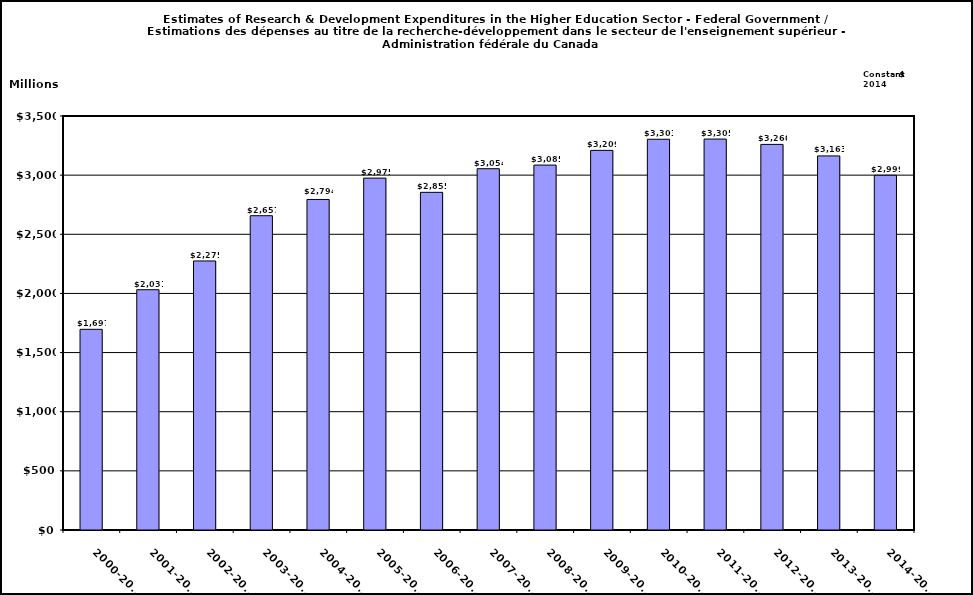
| Category | Series 0 |
|---|---|
| 2000-2001 | 1696.631 |
| 2001-2002 | 2031.364 |
| 2002-2003 | 2274.508 |
| 2003-2004 | 2657.09 |
| 2004-2005 | 2794.459 |
| 2005-2006 | 2974.846 |
| 2006-2007 | 2854.583 |
| 2007-2008 | 3054.431 |
| 2008-2009 | 3085.011 |
| 2009-2010 | 3209.344 |
| 2010-2011 | 3303.346 |
| 2011-2012 | 3305.113 |
| 2012-2013 | 3259.932 |
| 2013-2014 | 3162.625 |
| 2014-2015 | 2999 |